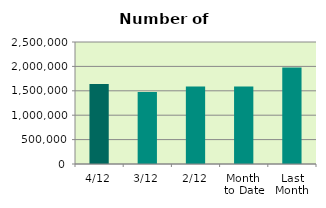
| Category | Series 0 |
|---|---|
| 4/12 | 1641392 |
| 3/12 | 1476834 |
| 2/12 | 1588060 |
| Month 
to Date | 1588456.5 |
| Last
Month | 1976001.238 |